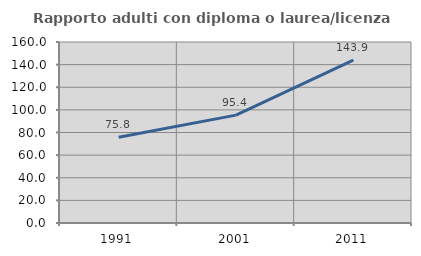
| Category | Rapporto adulti con diploma o laurea/licenza media  |
|---|---|
| 1991.0 | 75.806 |
| 2001.0 | 95.366 |
| 2011.0 | 143.891 |